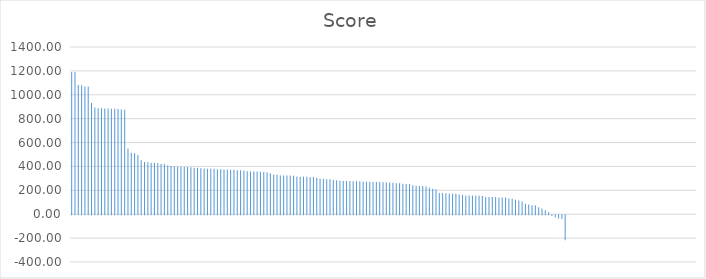
| Category | Score |
|---|---|
| 0 | 1190.9 |
| 1 | 1190.9 |
| 2 | 1082.5 |
| 3 | 1080.7 |
| 4 | 1069.5 |
| 5 | 1069.5 |
| 6 | 932 |
| 7 | 894.3 |
| 8 | 888.2 |
| 9 | 887.9 |
| 10 | 884.9 |
| 11 | 884.1 |
| 12 | 883.2 |
| 13 | 882.8 |
| 14 | 881.9 |
| 15 | 875.8 |
| 16 | 874.3 |
| 17 | 550.6 |
| 18 | 514.8 |
| 19 | 512.2 |
| 20 | 496 |
| 21 | 452.6 |
| 22 | 437.7 |
| 23 | 435.4 |
| 24 | 430.8 |
| 25 | 428.9 |
| 26 | 426.3 |
| 27 | 421.2 |
| 28 | 420 |
| 29 | 410.3 |
| 30 | 404.5 |
| 31 | 402.2 |
| 32 | 400.4 |
| 33 | 396.4 |
| 34 | 395.6 |
| 35 | 394.7 |
| 36 | 394.3 |
| 37 | 389.2 |
| 38 | 388.8 |
| 39 | 384.7 |
| 40 | 382.1 |
| 41 | 381.5 |
| 42 | 381.1 |
| 43 | 380.6 |
| 44 | 377.4 |
| 45 | 377.4 |
| 46 | 374.3 |
| 47 | 373.9 |
| 48 | 373.3 |
| 49 | 372.1 |
| 50 | 369 |
| 51 | 367.6 |
| 52 | 366.2 |
| 53 | 359.6 |
| 54 | 358.8 |
| 55 | 358.6 |
| 56 | 357.2 |
| 57 | 355.2 |
| 58 | 354.3 |
| 59 | 352.1 |
| 60 | 342.8 |
| 61 | 332.9 |
| 62 | 330.7 |
| 63 | 324.4 |
| 64 | 324.2 |
| 65 | 324.1 |
| 66 | 323.4 |
| 67 | 321.8 |
| 68 | 315.9 |
| 69 | 314.5 |
| 70 | 314.5 |
| 71 | 314.3 |
| 72 | 312.1 |
| 73 | 310.9 |
| 74 | 305 |
| 75 | 296.9 |
| 76 | 294.1 |
| 77 | 293.7 |
| 78 | 292.8 |
| 79 | 287.3 |
| 80 | 284.7 |
| 81 | 281 |
| 82 | 278.7 |
| 83 | 278.7 |
| 84 | 277.3 |
| 85 | 276.8 |
| 86 | 276.6 |
| 87 | 276.2 |
| 88 | 271.5 |
| 89 | 271.3 |
| 90 | 270.9 |
| 91 | 270.7 |
| 92 | 270.6 |
| 93 | 270.1 |
| 94 | 267 |
| 95 | 267 |
| 96 | 265.3 |
| 97 | 262.7 |
| 98 | 260.3 |
| 99 | 258.9 |
| 100 | 254.7 |
| 101 | 253.8 |
| 102 | 253 |
| 103 | 242.1 |
| 104 | 239.3 |
| 105 | 236.7 |
| 106 | 236.4 |
| 107 | 232.3 |
| 108 | 220.8 |
| 109 | 214.1 |
| 110 | 209.2 |
| 111 | 178.6 |
| 112 | 178.2 |
| 113 | 174.7 |
| 114 | 173.1 |
| 115 | 172.3 |
| 116 | 172.2 |
| 117 | 165.7 |
| 118 | 160.7 |
| 119 | 157.4 |
| 120 | 157.2 |
| 121 | 156.9 |
| 122 | 154.3 |
| 123 | 153.7 |
| 124 | 153.5 |
| 125 | 144.3 |
| 126 | 144.3 |
| 127 | 144.3 |
| 128 | 143.7 |
| 129 | 140.9 |
| 130 | 140.9 |
| 131 | 140.6 |
| 132 | 132.6 |
| 133 | 130.2 |
| 134 | 121.6 |
| 135 | 115.2 |
| 136 | 106.1 |
| 137 | 88.3 |
| 138 | 82.1 |
| 139 | 74.9 |
| 140 | 74.3 |
| 141 | 58.5 |
| 142 | 48.9 |
| 143 | 33.9 |
| 144 | 15.9 |
| 145 | -6.3 |
| 146 | -19.5 |
| 147 | -28.3 |
| 148 | -32.1 |
| 149 | -209.5 |
| 150 | 0 |
| 151 | 0 |
| 152 | 0 |
| 153 | 0 |
| 154 | 0 |
| 155 | 0 |
| 156 | 0 |
| 157 | 0 |
| 158 | 0 |
| 159 | 0 |
| 160 | 0 |
| 161 | 0 |
| 162 | 0 |
| 163 | 0 |
| 164 | 0 |
| 165 | 0 |
| 166 | 0 |
| 167 | 0 |
| 168 | 0 |
| 169 | 0 |
| 170 | 0 |
| 171 | 0 |
| 172 | 0 |
| 173 | 0 |
| 174 | 0 |
| 175 | 0 |
| 176 | 0 |
| 177 | 0 |
| 178 | 0 |
| 179 | 0 |
| 180 | 0 |
| 181 | 0 |
| 182 | 0 |
| 183 | 0 |
| 184 | 0 |
| 185 | 0 |
| 186 | 0 |
| 187 | 0 |
| 188 | 0 |